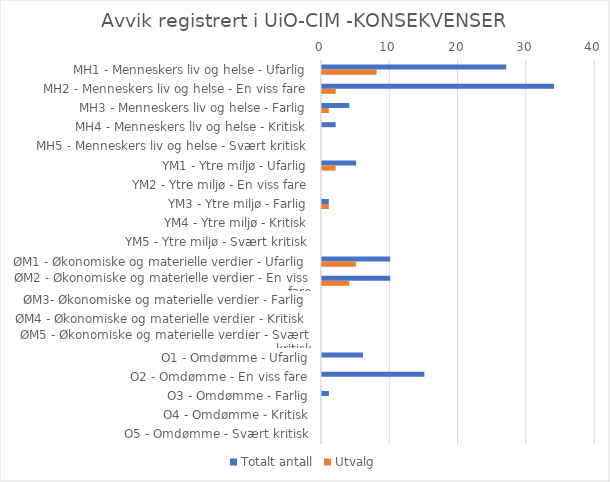
| Category | Totalt antall | Utvalg |
|---|---|---|
| MH1 - Menneskers liv og helse - Ufarlig | 27 | 8 |
| MH2 - Menneskers liv og helse - En viss fare | 34 | 2 |
| MH3 - Menneskers liv og helse - Farlig | 4 | 1 |
| MH4 - Menneskers liv og helse - Kritisk | 2 | 0 |
| MH5 - Menneskers liv og helse - Svært kritisk | 0 | 0 |
| YM1 - Ytre miljø - Ufarlig | 5 | 2 |
| YM2 - Ytre miljø - En viss fare | 0 | 0 |
| YM3 - Ytre miljø - Farlig | 1 | 1 |
| YM4 - Ytre miljø - Kritisk | 0 | 0 |
| YM5 - Ytre miljø - Svært kritisk | 0 | 0 |
| ØM1 - Økonomiske og materielle verdier - Ufarlig | 10 | 5 |
| ØM2 - Økonomiske og materielle verdier - En viss fare | 10 | 4 |
| ØM3- Økonomiske og materielle verdier - Farlig | 0 | 0 |
| ØM4 - Økonomiske og materielle verdier - Kritisk | 0 | 0 |
| ØM5 - Økonomiske og materielle verdier - Svært kritisk | 0 | 0 |
| O1 - Omdømme - Ufarlig | 6 | 0 |
| O2 - Omdømme - En viss fare | 15 | 0 |
| O3 - Omdømme - Farlig | 1 | 0 |
| O4 - Omdømme - Kritisk | 0 | 0 |
| O5 - Omdømme - Svært kritisk | 0 | 0 |